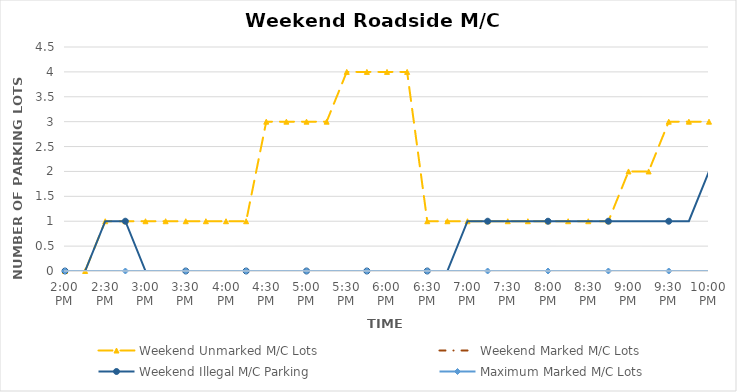
| Category | Weekend Unmarked M/C Lots | Weekend Marked M/C Lots | Weekend Illegal M/C Parking | Maximum Marked M/C Lots |
|---|---|---|---|---|
| 0.5833333333333334 | 0 | 0 | 0 | 0 |
| 0.59375 | 0 | 0 | 0 | 0 |
| 0.604166666666667 | 1 | 0 | 1 | 0 |
| 0.614583333333334 | 1 | 0 | 1 | 0 |
| 0.625 | 1 | 0 | 0 | 0 |
| 0.635416666666667 | 1 | 0 | 0 | 0 |
| 0.645833333333334 | 1 | 0 | 0 | 0 |
| 0.656250000000001 | 1 | 0 | 0 | 0 |
| 0.666666666666667 | 1 | 0 | 0 | 0 |
| 0.677083333333334 | 1 | 0 | 0 | 0 |
| 0.687500000000001 | 3 | 0 | 0 | 0 |
| 0.697916666666668 | 3 | 0 | 0 | 0 |
| 0.708333333333335 | 3 | 0 | 0 | 0 |
| 0.718750000000001 | 3 | 0 | 0 | 0 |
| 0.729166666666668 | 4 | 0 | 0 | 0 |
| 0.739583333333335 | 4 | 0 | 0 | 0 |
| 0.750000000000002 | 4 | 0 | 0 | 0 |
| 0.760416666666668 | 4 | 0 | 0 | 0 |
| 0.770833333333335 | 1 | 0 | 0 | 0 |
| 0.781250000000002 | 1 | 0 | 0 | 0 |
| 0.791666666666669 | 1 | 0 | 1 | 0 |
| 0.802083333333335 | 1 | 0 | 1 | 0 |
| 0.812500000000002 | 1 | 0 | 1 | 0 |
| 0.822916666666669 | 1 | 0 | 1 | 0 |
| 0.833333333333336 | 1 | 0 | 1 | 0 |
| 0.843750000000002 | 1 | 0 | 1 | 0 |
| 0.854166666666669 | 1 | 0 | 1 | 0 |
| 0.864583333333336 | 1 | 0 | 1 | 0 |
| 0.875000000000002 | 2 | 0 | 1 | 0 |
| 0.885416666666669 | 2 | 0 | 1 | 0 |
| 0.895833333333336 | 3 | 0 | 1 | 0 |
| 0.906250000000003 | 3 | 0 | 1 | 0 |
| 0.916666666666669 | 3 | 0 | 2 | 0 |